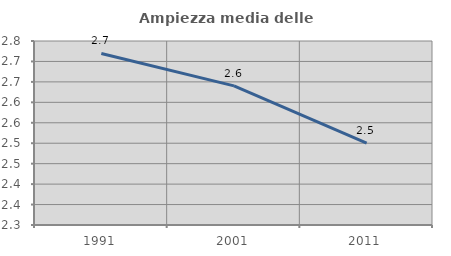
| Category | Ampiezza media delle famiglie |
|---|---|
| 1991.0 | 2.72 |
| 2001.0 | 2.64 |
| 2011.0 | 2.5 |